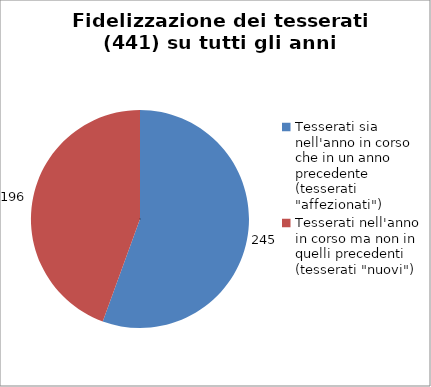
| Category | Nr. Tesserati |
|---|---|
| Tesserati sia nell'anno in corso che in un anno precedente (tesserati "affezionati") | 245 |
| Tesserati nell'anno in corso ma non in quelli precedenti (tesserati "nuovi") | 196 |